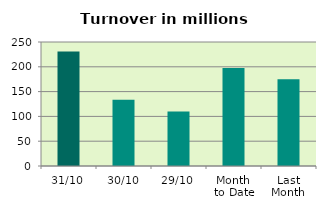
| Category | Series 0 |
|---|---|
| 31/10 | 231.062 |
| 30/10 | 133.327 |
| 29/10 | 110.052 |
| Month 
to Date | 197.652 |
| Last
Month | 174.723 |